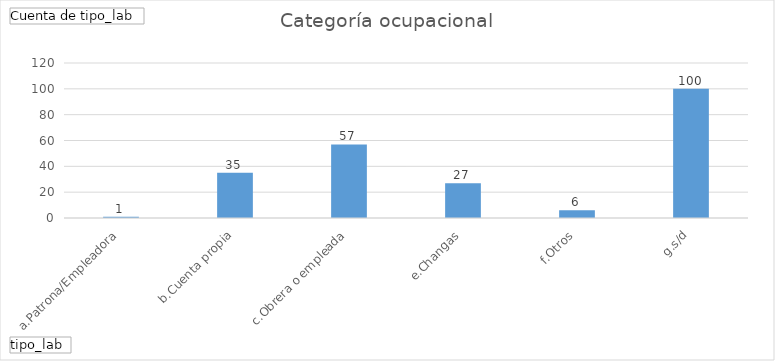
| Category | Total |
|---|---|
| a.Patrona/Empleadora | 1 |
| b.Cuenta propia | 35 |
| c.Obrera o empleada | 57 |
| e.Changas | 27 |
| f.Otros | 6 |
| g.s/d | 100 |